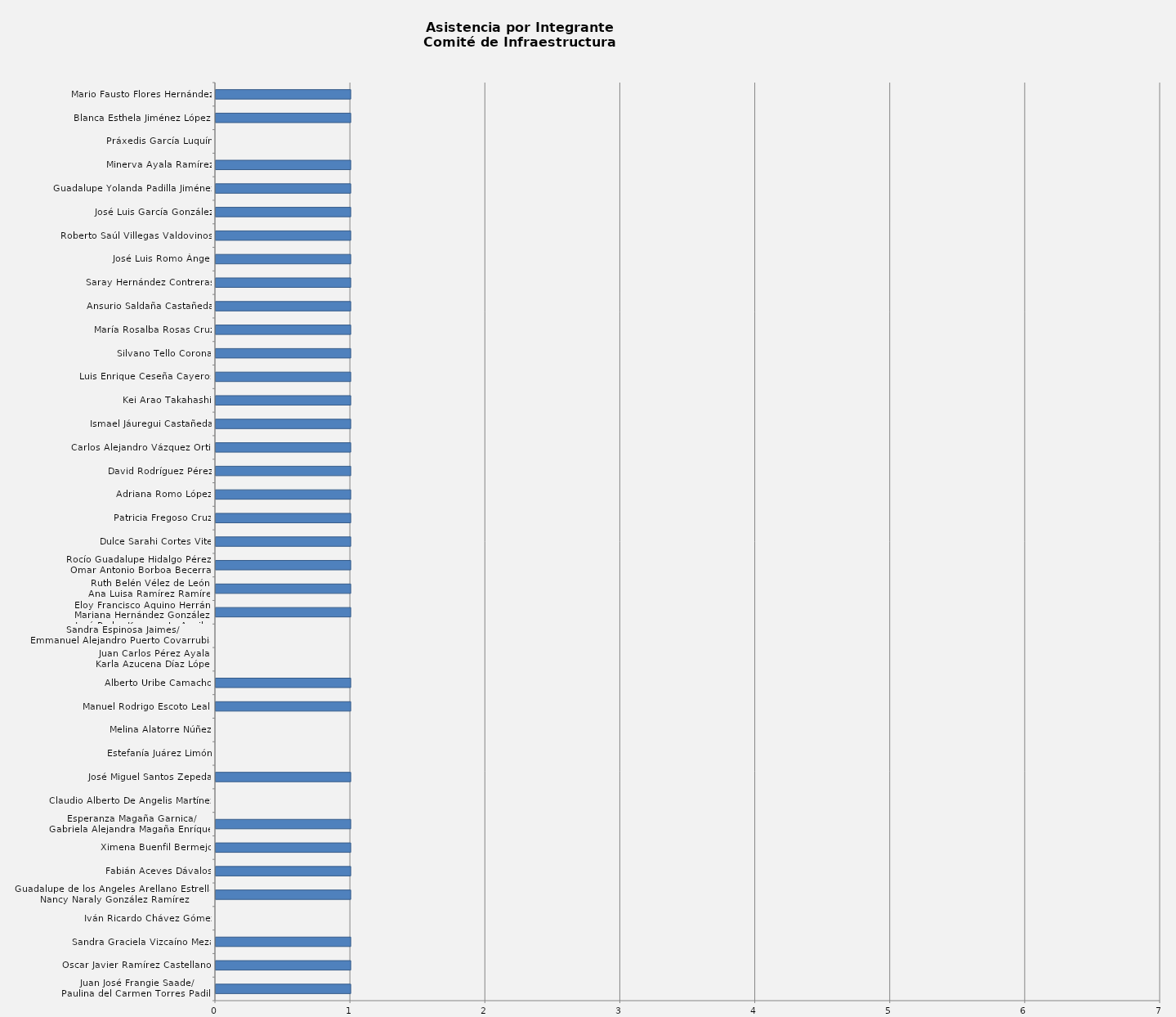
| Category | Series 0 |
|---|---|
| Juan José Frangie Saade/
Paulina del Carmen Torres Padilla | 1 |
| Oscar Javier Ramírez Castellanos | 1 |
| Sandra Graciela Vizcaíno Meza | 1 |
| Iván Ricardo Chávez Gómez | 0 |
| Guadalupe de los Ángeles Arellano Estrella/
Nancy Naraly González Ramírez | 1 |
| Fabián Aceves Dávalos | 1 |
| Ximena Buenfil Bermejo | 1 |
| Esperanza Magaña Garnica/
Gabriela Alejandra Magaña Enríquez | 1 |
| Claudio Alberto De Angelis Martínez | 0 |
| José Miguel Santos Zepeda | 1 |
| Estefanía Juárez Limón | 0 |
| Melina Alatorre Núñez | 0 |
| Manuel Rodrigo Escoto Leal  | 1 |
| Alberto Uribe Camacho | 1 |
| Juan Carlos Pérez Ayala/
Karla Azucena Díaz López | 0 |
| Sandra Espinosa Jaimes/
Emmanuel Alejandro Puerto Covarrubias | 0 |
| Eloy Francisco Aquino Herrán/
Mariana Hernández González/
José Pedro Kumamoto Aguilar | 1 |
| Ruth Belén Vélez de León/
Ana Luisa Ramírez Ramírez | 1 |
| Rocío Guadalupe Hidalgo Pérez/
Omar Antonio Borboa Becerra | 1 |
| Dulce Sarahi Cortes Vite | 1 |
| Patricia Fregoso Cruz | 1 |
| Adriana Romo López | 1 |
| David Rodríguez Pérez | 1 |
| Carlos Alejandro Vázquez Ortiz | 1 |
| Ismael Jáuregui Castañeda | 1 |
| Kei Arao Takahashi | 1 |
| Luis Enrique Ceseña Cayeros | 1 |
| Silvano Tello Corona | 1 |
| María Rosalba Rosas Cruz | 1 |
| Ansurio Saldaña Castañeda | 1 |
| Saray Hernández Contreras | 1 |
| José Luis Romo Ángel | 1 |
| Roberto Saúl Villegas Valdovinos  | 1 |
| José Luis García González | 1 |
| Guadalupe Yolanda Padilla Jiménez | 1 |
| Minerva Ayala Ramírez | 1 |
| Práxedis García Luquín | 0 |
| Blanca Esthela Jiménez López  | 1 |
| Mario Fausto Flores Hernández | 1 |